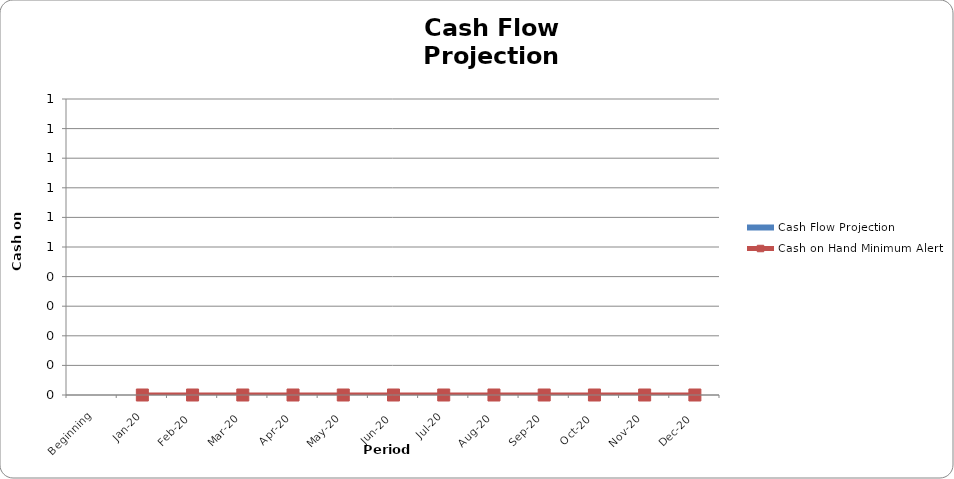
| Category | Cash Flow Projection |
|---|---|
| Beginning | 0 |
| Jan-20 | 0 |
| Feb-20 | 0 |
| Mar-20 | 0 |
| Apr-20 | 0 |
| May-20 | 0 |
| Jun-20 | 0 |
| Jul-20 | 0 |
| Aug-20 | 0 |
| Sep-20 | 0 |
| Oct-20 | 0 |
| Nov-20 | 0 |
| Dec-20 | 0 |